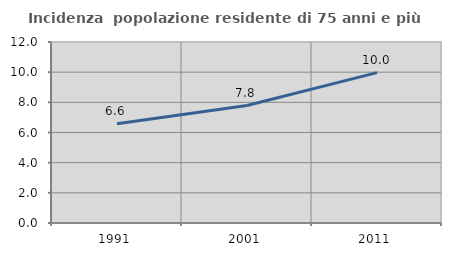
| Category | Incidenza  popolazione residente di 75 anni e più |
|---|---|
| 1991.0 | 6.574 |
| 2001.0 | 7.788 |
| 2011.0 | 9.971 |